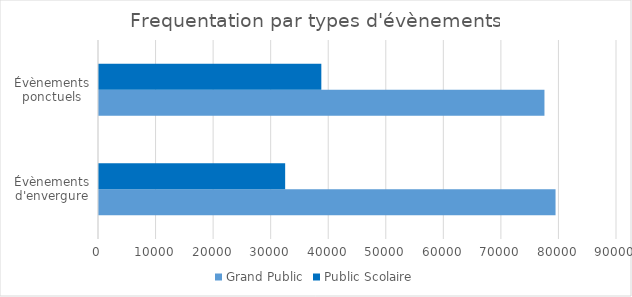
| Category | Grand Public | Public Scolaire |
|---|---|---|
| Évènements d'envergure | 79322 | 32345 |
| Évènements ponctuels | 77396 | 38629 |